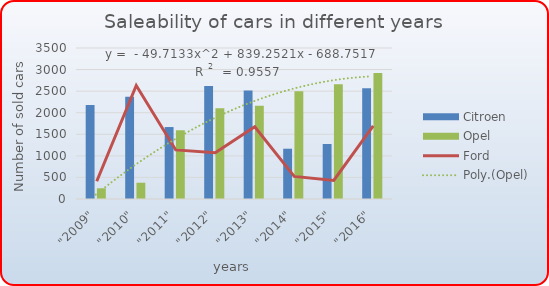
| Category | Citroen | Opel |
|---|---|---|
| "2009" | 2178.405 | 247.982 |
| "2010" | 2369.512 | 377.227 |
| "2011" | 1667.576 | 1593.214 |
| "2012" | 2616.503 | 2100.898 |
| "2013" | 2517.64 | 2160.829 |
| "2014" | 1165.534 | 2498.022 |
| "2015" | 1274.964 | 2661.05 |
| "2016" | 2566.977 | 2922.338 |